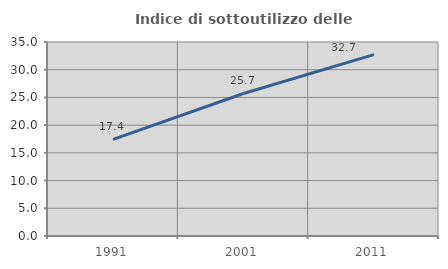
| Category | Indice di sottoutilizzo delle abitazioni  |
|---|---|
| 1991.0 | 17.423 |
| 2001.0 | 25.71 |
| 2011.0 | 32.726 |